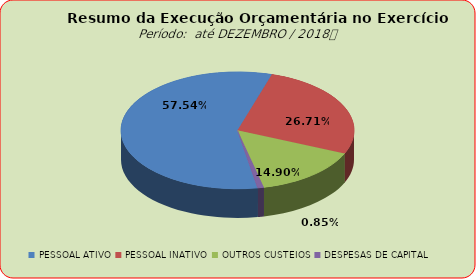
| Category | Series 0 |
|---|---|
| PESSOAL ATIVO | 156474133.46 |
| PESSOAL INATIVO | 72628778.13 |
| OUTROS CUSTEIOS | 40526361.95 |
| DESPESAS DE CAPITAL | 2324242.1 |